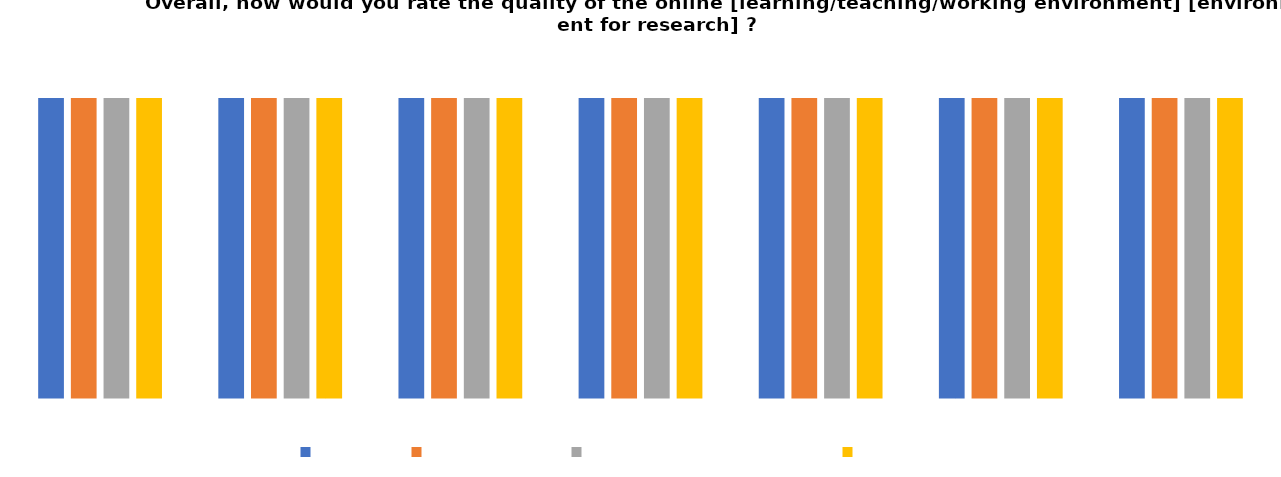
| Category | Students | Teaching staff | Professional services staff | Researchers |
|---|---|---|---|---|
| Best imaginable | 0.143 | 0.143 | 0.143 | 0.143 |
| Excellent | 0.143 | 0.143 | 0.143 | 0.143 |
| Good | 0.143 | 0.143 | 0.143 | 0.143 |
| Average | 0.143 | 0.143 | 0.143 | 0.143 |
| Poor | 0.143 | 0.143 | 0.143 | 0.143 |
| Awful | 0.143 | 0.143 | 0.143 | 0.143 |
| Worst imaginable | 0.143 | 0.143 | 0.143 | 0.143 |